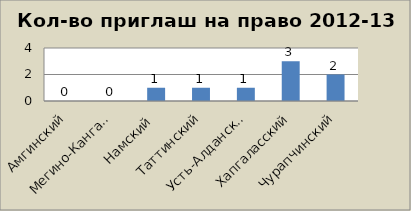
| Category | Series 0 |
|---|---|
| Амгинский | 0 |
| Мегино-Кангаласский | 0 |
| Намский | 1 |
| Таттинский | 1 |
| Усть-Алданский | 1 |
| Хапгаласский | 3 |
| Чурапчинский | 2 |